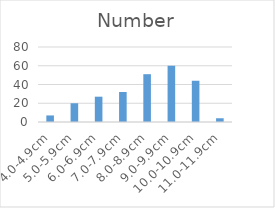
| Category | Number |
|---|---|
| 4.0-4.9cm | 7 |
| 5.0-5.9cm | 20 |
| 6.0-6.9cm | 27 |
| 7.0-7.9cm | 32 |
| 8.0-8.9cm | 51 |
| 9.0-9.9cm | 60 |
| 10.0-10.9cm | 44 |
| 11.0-11.9cm | 4 |